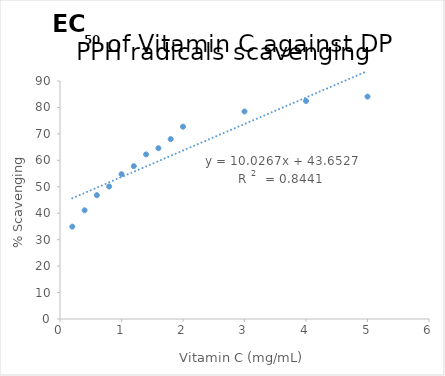
| Category | Series 0 |
|---|---|
| 0.2 | 34.917 |
| 0.4 | 41.11 |
| 0.6 | 46.817 |
| 0.8 | 50.113 |
| 1.0 | 54.75 |
| 1.2 | 57.8 |
| 1.4 | 62.243 |
| 1.6 | 64.58 |
| 1.8 | 68.03 |
| 2.0 | 72.73 |
| 3.0 | 78.47 |
| 4.0 | 82.45 |
| 5.0 | 84.09 |